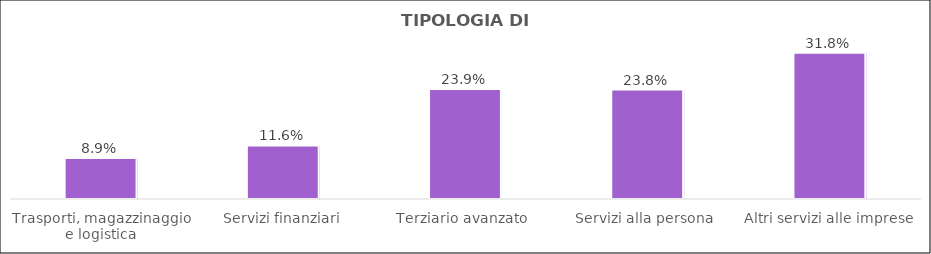
| Category | Series 0 |
|---|---|
| Trasporti, magazzinaggio e logistica | 0.089 |
| Servizi finanziari | 0.116 |
| Terziario avanzato  | 0.239 |
| Servizi alla persona  | 0.238 |
| Altri servizi alle imprese | 0.318 |